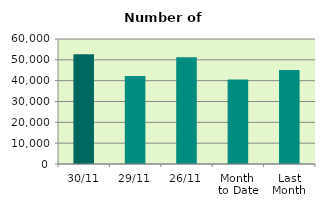
| Category | Series 0 |
|---|---|
| 30/11 | 52736 |
| 29/11 | 42232 |
| 26/11 | 51206 |
| Month 
to Date | 40546.091 |
| Last
Month | 45060.857 |